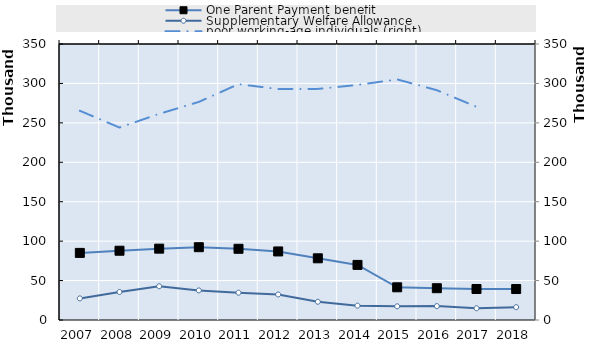
| Category | One Parent Payment benefit | Supplementary Welfare Allowance |
|---|---|---|
| 2007.0 | 85084 | 27379 |
| 2008.0 | 87840 | 35546 |
| 2009.0 | 90484 | 42775 |
| 2010.0 | 92326 | 37499 |
| 2011.0 | 90307 | 34597 |
| 2012.0 | 86941 | 32358 |
| 2013.0 | 78246 | 23127 |
| 2014.0 | 69884 | 18187 |
| 2015.0 | 41468 | 17343 |
| 2016.0 | 40317 | 17601 |
| 2017.0 | 39310 | 14891 |
| 2018.0 | 39265 | 16269 |